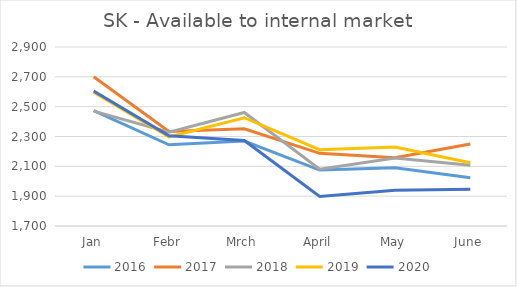
| Category | 2016 | 2017 | 2018 | 2019 | 2020 |
|---|---|---|---|---|---|
| Jan | 2474 | 2701 | 2470 | 2597 | 2605 |
| Febr | 2244 | 2334 | 2329 | 2297 | 2305 |
| Mrch | 2269 | 2352 | 2461 | 2426 | 2273 |
| April | 2075 | 2187 | 2081 | 2212 | 1898 |
| May | 2091 | 2157 | 2156 | 2230 | 1939 |
| June | 2024 | 2250 | 2108 | 2124 | 1947 |